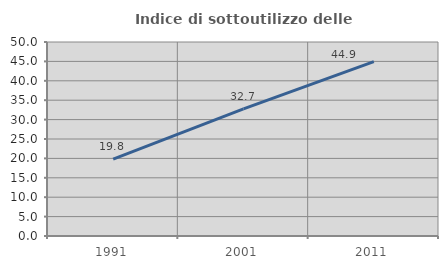
| Category | Indice di sottoutilizzo delle abitazioni  |
|---|---|
| 1991.0 | 19.822 |
| 2001.0 | 32.742 |
| 2011.0 | 44.919 |